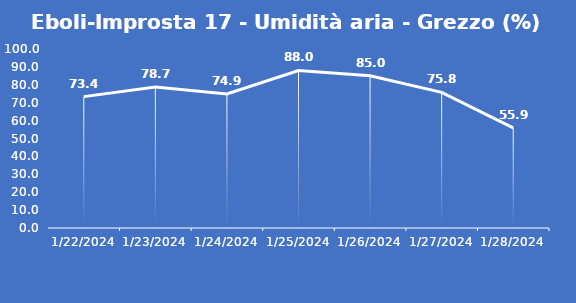
| Category | Eboli-Improsta 17 - Umidità aria - Grezzo (%) |
|---|---|
| 1/22/24 | 73.4 |
| 1/23/24 | 78.7 |
| 1/24/24 | 74.9 |
| 1/25/24 | 88 |
| 1/26/24 | 85 |
| 1/27/24 | 75.8 |
| 1/28/24 | 55.9 |